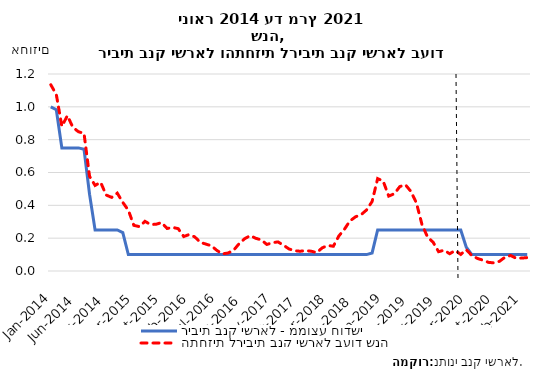
| Category | ריבית בנק ישראל - ממוצע חודשי | התחזית לריבית בנק ישראל בעוד שנה |
|---|---|---|
| 2014-01-31 | 1 | 1.134 |
| 2014-02-28 | 0.982 | 1.075 |
| 2014-03-31 | 0.75 | 0.881 |
| 2014-04-30 | 0.75 | 0.946 |
| 2014-05-31 | 0.75 | 0.875 |
| 2014-06-30 | 0.75 | 0.848 |
| 2014-07-31 | 0.742 | 0.839 |
| 2014-08-31 | 0.468 | 0.577 |
| 2014-09-30 | 0.25 | 0.521 |
| 2014-10-31 | 0.25 | 0.54 |
| 2014-11-30 | 0.25 | 0.463 |
| 2014-12-31 | 0.25 | 0.448 |
| 2015-01-31 | 0.25 | 0.474 |
| 2015-02-28 | 0.234 | 0.418 |
| 2015-03-31 | 0.1 | 0.37 |
| 2015-04-30 | 0.1 | 0.278 |
| 2015-05-31 | 0.1 | 0.27 |
| 2015-06-30 | 0.1 | 0.303 |
| 2015-07-31 | 0.1 | 0.283 |
| 2015-08-31 | 0.1 | 0.285 |
| 2015-09-30 | 0.1 | 0.295 |
| 2015-10-31 | 0.1 | 0.259 |
| 2015-11-30 | 0.1 | 0.266 |
| 2015-12-31 | 0.1 | 0.258 |
| 2016-01-31 | 0.1 | 0.21 |
| 2016-02-29 | 0.1 | 0.222 |
| 2016-03-31 | 0.1 | 0.207 |
| 2016-04-30 | 0.1 | 0.174 |
| 2016-05-31 | 0.1 | 0.164 |
| 2016-06-30 | 0.1 | 0.153 |
| 2016-07-31 | 0.1 | 0.125 |
| 2016-08-31 | 0.1 | 0.104 |
| 2016-09-30 | 0.1 | 0.11 |
| 2016-10-31 | 0.1 | 0.126 |
| 2016-11-30 | 0.1 | 0.167 |
| 2016-12-31 | 0.1 | 0.197 |
| 2017-01-31 | 0.1 | 0.215 |
| 2017-02-28 | 0.1 | 0.199 |
| 2017-03-31 | 0.1 | 0.189 |
| 2017-04-30 | 0.1 | 0.162 |
| 2017-05-31 | 0.1 | 0.172 |
| 2017-06-30 | 0.1 | 0.177 |
| 2017-07-31 | 0.1 | 0.157 |
| 2017-08-31 | 0.1 | 0.134 |
| 2017-09-30 | 0.1 | 0.124 |
| 2017-10-31 | 0.1 | 0.12 |
| 2017-11-30 | 0.1 | 0.124 |
| 2017-12-31 | 0.1 | 0.121 |
| 2018-01-31 | 0.1 | 0.112 |
| 2018-02-28 | 0.1 | 0.141 |
| 2018-03-31 | 0.1 | 0.156 |
| 2018-04-30 | 0.1 | 0.151 |
| 2018-05-31 | 0.1 | 0.213 |
| 2018-06-30 | 0.1 | 0.254 |
| 2018-07-31 | 0.1 | 0.305 |
| 2018-08-31 | 0.1 | 0.33 |
| 2018-09-30 | 0.1 | 0.343 |
| 2018-10-31 | 0.1 | 0.372 |
| 2018-11-30 | 0.11 | 0.423 |
| 2018-12-31 | 0.25 | 0.563 |
| 2019-01-31 | 0.25 | 0.548 |
| 2019-02-28 | 0.25 | 0.456 |
| 2019-03-31 | 0.25 | 0.47 |
| 2019-04-30 | 0.25 | 0.514 |
| 2019-05-31 | 0.25 | 0.526 |
| 2019-06-30 | 0.25 | 0.485 |
| 2019-07-31 | 0.25 | 0.415 |
| 2019-08-31 | 0.25 | 0.283 |
| 2019-09-30 | 0.25 | 0.207 |
| 2019-10-31 | 0.25 | 0.176 |
| 2019-11-30 | 0.25 | 0.118 |
| 2019-12-31 | 0.25 | 0.126 |
| 2020-01-31 | 0.25 | 0.105 |
| 2020-02-29 | 0.25 | 0.125 |
| 2020-03-31 | 0.25 | 0.101 |
| 2020-04-30 | 0.145 | 0.13 |
| 2020-05-31 | 0.1 | 0.094 |
| 2020-06-30 | 0.1 | 0.077 |
| 2020-07-31 | 0.1 | 0.066 |
| 2020-08-31 | 0.1 | 0.053 |
| 2020-09-30 | 0.1 | 0.049 |
| 2020-10-31 | 0.1 | 0.059 |
| 2020-11-30 | 0.1 | 0.084 |
| 2020-12-31 | 0.1 | 0.095 |
| 2021-01-31 | 0.1 | 0.078 |
| 2021-02-28 | 0.1 | 0.079 |
| 2021-03-31 | 0.1 | 0.082 |